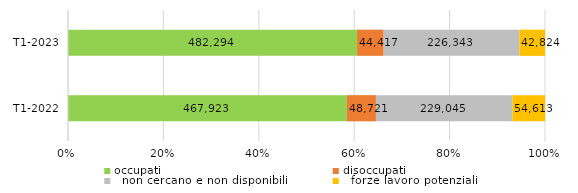
| Category | occupati | disoccupati |   non cercano e non disponibili |   forze lavoro potenziali |
|---|---|---|---|---|
|   T1-2022 | 467923 | 48721 | 229045 | 54613 |
|   T1-2023 | 482294 | 44417 | 226343 | 42824 |